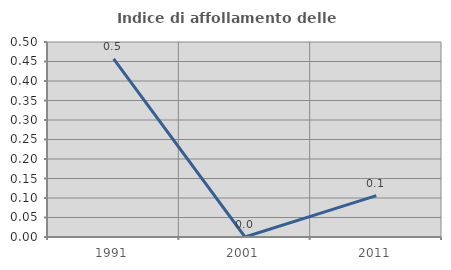
| Category | Indice di affollamento delle abitazioni  |
|---|---|
| 1991.0 | 0.457 |
| 2001.0 | 0 |
| 2011.0 | 0.106 |